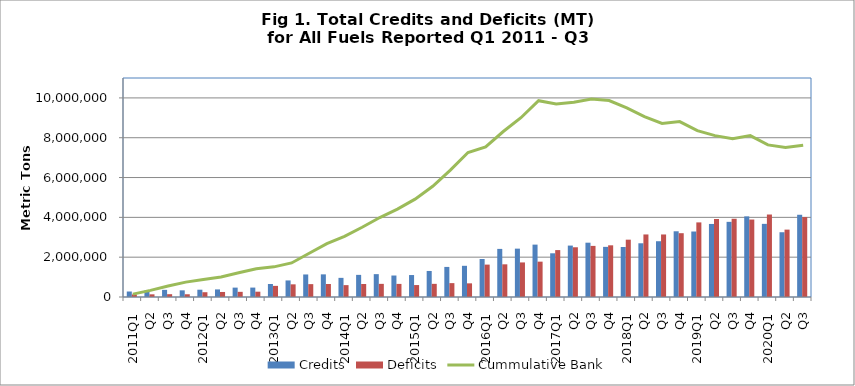
| Category | Credits | Deficits |
|---|---|---|
| 2011Q1 | 275639 | 132283 |
| Q2 | 325071 | 134760 |
| Q3 | 358817 | 141381 |
| Q4 | 334451 | 137396 |
| 2012Q1 | 366391 | 240260 |
| Q2 | 380783 | 252750 |
| Q3 | 471290 | 259582 |
| Q4 | 473045 | 266666 |
| 2013Q1 | 652535 | 558804 |
| Q2 | 832199 | 636140 |
| Q3 | 1132141 | 646613 |
| Q4 | 1137322 | 653565 |
| 2014Q1 | 961263 | 596240 |
| Q2 | 1111616 | 653122 |
| Q3 | 1148264 | 660254 |
| Q4 | 1079148 | 657732 |
| 2015Q1 | 1102924 | 600144 |
| Q2 | 1307672 | 660642 |
| Q3 | 1510754 | 696772 |
| Q4 | 1566898 | 686210 |
| 2016Q1 | 1907907 | 1627195 |
| Q2 | 2416121 | 1641557 |
| Q3 | 2428897 | 1736480 |
| Q4 | 2631117 | 1775489 |
| 2017Q1 | 2195244 | 2356219 |
| Q2 | 2582576 | 2497783 |
| Q3 | 2727782 | 2566731 |
| Q4 | 2518172 | 2595941 |
| 2018Q1 | 2510703 | 2879229 |
| Q2 | 2698412 | 3141737 |
| Q3 | 2801498 | 3140867 |
| Q4 | 3300906 | 3204670 |
| 2019Q1 | 3289327 | 3747363 |
| Q2 | 3668996 | 3918803 |
| Q3 | 3774747 | 3929777 |
| Q4 | 4050059 | 3891101 |
| 2020Q1 | 3673634 | 4143129 |
| Q2 | 3252884 | 3384552 |
| Q3 | 4130214 | 4014618 |